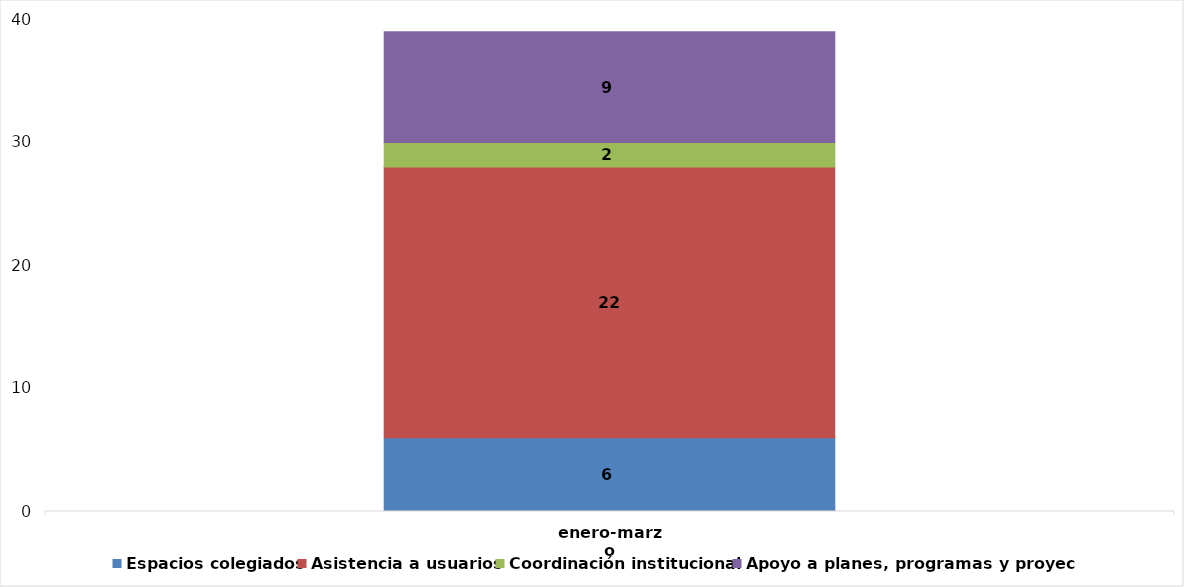
| Category | Espacios colegiados | Asistencia a usuarios  | Coordinación institucional  | Apoyo a planes, programas y proyectos |
|---|---|---|---|---|
| enero-marzo | 6 | 22 | 2 | 9 |